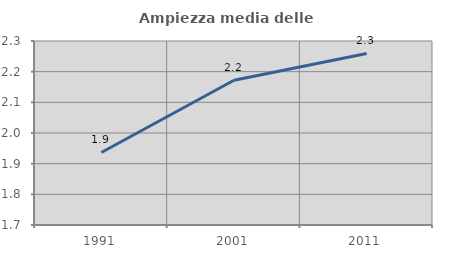
| Category | Ampiezza media delle famiglie |
|---|---|
| 1991.0 | 1.937 |
| 2001.0 | 2.172 |
| 2011.0 | 2.259 |